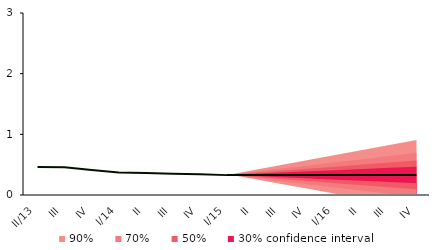
| Category | Centerline |
|---|---|
| II/13 | 0.463 |
| III | 0.458 |
| IV | 0.412 |
| I/14 | 0.372 |
| II | 0.363 |
| III | 0.35 |
| IV | 0.344 |
| I/15 | 0.328 |
| II | 0.331 |
| III | 0.331 |
| IV | 0.331 |
| I/16 | 0.331 |
| II | 0.331 |
| III | 0.331 |
| IV | 0.331 |